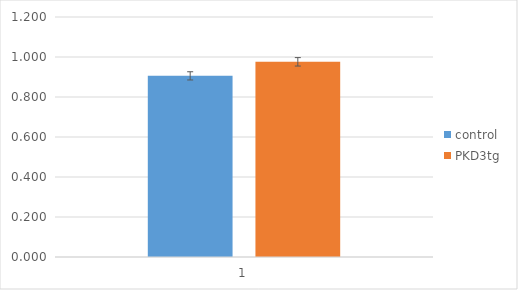
| Category | control | PKD3tg |
|---|---|---|
| 0 | 0.906 | 0.976 |